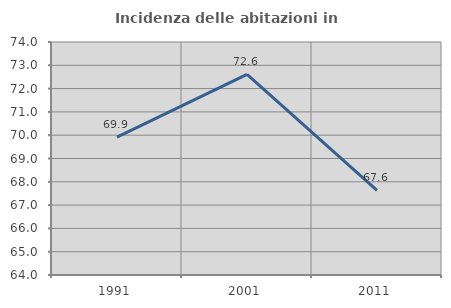
| Category | Incidenza delle abitazioni in proprietà  |
|---|---|
| 1991.0 | 69.92 |
| 2001.0 | 72.608 |
| 2011.0 | 67.629 |